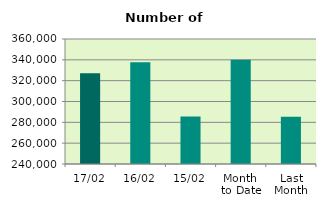
| Category | Series 0 |
|---|---|
| 17/02 | 327090 |
| 16/02 | 337722 |
| 15/02 | 285518 |
| Month 
to Date | 340161.538 |
| Last
Month | 285405.636 |